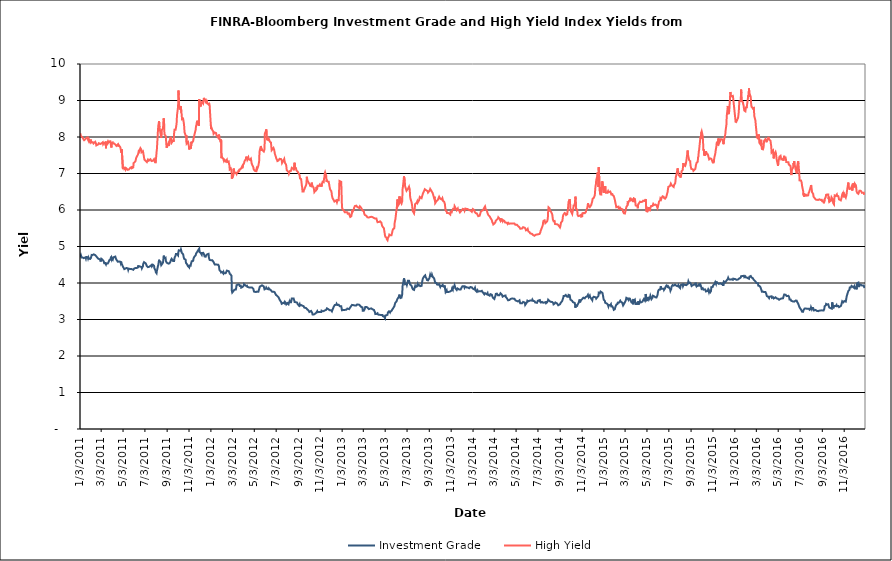
| Category | Investment Grade | High Yield |
|---|---|---|
| 1/3/11 | 4.707 | 8.102 |
| 1/4/11 | 4.687 | 8.068 |
| 1/5/11 | 4.763 | 8.023 |
| 1/6/11 | 4.756 | 8.024 |
| 1/7/11 | 4.7 | 7.997 |
| 1/10/11 | 4.699 | 7.987 |
| 1/11/11 | 4.695 | 7.979 |
| 1/12/11 | 4.706 | 7.94 |
| 1/13/11 | 4.682 | 7.933 |
| 1/14/11 | 4.658 | 7.912 |
| 1/18/11 | 4.703 | 7.948 |
| 1/19/11 | 4.671 | 7.953 |
| 1/20/11 | 4.712 | 7.966 |
| 1/21/11 | 4.718 | 7.981 |
| 1/24/11 | 4.707 | 7.988 |
| 1/25/11 | 4.673 | 7.921 |
| 1/26/11 | 4.705 | 7.926 |
| 1/27/11 | 4.696 | 7.883 |
| 1/28/11 | 4.663 | 7.93 |
| 1/31/11 | 4.66 | 7.873 |
| 2/1/11 | 4.667 | 7.931 |
| 2/2/11 | 4.688 | 7.899 |
| 2/3/11 | 4.727 | 7.911 |
| 2/4/11 | 4.77 | 7.851 |
| 2/7/11 | 4.768 | 7.858 |
| 2/8/11 | 4.779 | 7.831 |
| 2/9/11 | 4.783 | 7.823 |
| 2/10/11 | 4.785 | 7.809 |
| 2/11/11 | 4.773 | 7.839 |
| 2/14/11 | 4.764 | 7.868 |
| 2/15/11 | 4.753 | 7.851 |
| 2/16/11 | 4.745 | 7.822 |
| 2/17/11 | 4.73 | 7.77 |
| 2/18/11 | 4.739 | 7.791 |
| 2/22/11 | 4.668 | 7.795 |
| 2/23/11 | 4.665 | 7.81 |
| 2/24/11 | 4.682 | 7.83 |
| 2/25/11 | 4.655 | 7.818 |
| 2/28/11 | 4.638 | 7.808 |
| 3/1/11 | 4.589 | 7.83 |
| 3/2/11 | 4.586 | 7.834 |
| 3/3/11 | 4.664 | 7.823 |
| 3/4/11 | 4.638 | 7.821 |
| 3/7/11 | 4.629 | 7.855 |
| 3/8/11 | 4.65 | 7.805 |
| 3/9/11 | 4.614 | 7.813 |
| 3/10/11 | 4.586 | 7.838 |
| 3/11/11 | 4.543 | 7.823 |
| 3/14/11 | 4.548 | 7.811 |
| 3/15/11 | 4.542 | 7.874 |
| 3/16/11 | 4.508 | 7.69 |
| 3/17/11 | 4.538 | 7.866 |
| 3/18/11 | 4.528 | 7.809 |
| 3/21/11 | 4.536 | 7.872 |
| 3/22/11 | 4.552 | 7.838 |
| 3/23/11 | 4.57 | 7.856 |
| 3/24/11 | 4.59 | 7.865 |
| 3/25/11 | 4.62 | 7.879 |
| 3/28/11 | 4.647 | 7.882 |
| 3/29/11 | 4.677 | 7.901 |
| 3/30/11 | 4.679 | 7.889 |
| 3/31/11 | 4.641 | 7.711 |
| 4/1/11 | 4.7 | 7.847 |
| 4/4/11 | 4.648 | 7.854 |
| 4/5/11 | 4.683 | 7.823 |
| 4/6/11 | 4.708 | 7.827 |
| 4/7/11 | 4.711 | 7.823 |
| 4/8/11 | 4.712 | 7.821 |
| 4/11/11 | 4.724 | 7.795 |
| 4/12/11 | 4.686 | 7.786 |
| 4/13/11 | 4.658 | 7.811 |
| 4/14/11 | 4.675 | 7.756 |
| 4/15/11 | 4.623 | 7.772 |
| 4/18/11 | 4.582 | 7.794 |
| 4/19/11 | 4.576 | 7.741 |
| 4/20/11 | 4.584 | 7.785 |
| 4/21/11 | 4.59 | 7.782 |
| 4/25/11 | 4.582 | 7.718 |
| 4/26/11 | 4.548 | 7.699 |
| 4/27/11 | 4.587 | 7.714 |
| 4/28/11 | 4.54 | 7.566 |
| 4/29/11 | 4.516 | 7.663 |
| 5/2/11 | 4.455 | 7.147 |
| 5/3/11 | 4.438 | 7.173 |
| 5/4/11 | 4.418 | 7.156 |
| 5/5/11 | 4.409 | 7.158 |
| 5/6/11 | 4.381 | 7.124 |
| 5/9/11 | 4.396 | 7.15 |
| 5/10/11 | 4.417 | 7.107 |
| 5/11/11 | 4.414 | 7.123 |
| 5/12/11 | 4.41 | 7.139 |
| 5/13/11 | 4.401 | 7.138 |
| 5/16/11 | 4.4 | 7.101 |
| 5/17/11 | 4.361 | 7.107 |
| 5/18/11 | 4.394 | 7.121 |
| 5/19/11 | 4.411 | 7.112 |
| 5/20/11 | 4.402 | 7.124 |
| 5/23/11 | 4.383 | 7.158 |
| 5/24/11 | 4.401 | 7.152 |
| 5/25/11 | 4.403 | 7.177 |
| 5/26/11 | 4.385 | 7.173 |
| 5/27/11 | 4.38 | 7.143 |
| 5/31/11 | 4.362 | 7.166 |
| 6/1/11 | 4.344 | 7.286 |
| 6/2/11 | 4.385 | 7.311 |
| 6/3/11 | 4.4 | 7.312 |
| 6/6/11 | 4.411 | 7.332 |
| 6/7/11 | 4.412 | 7.373 |
| 6/8/11 | 4.393 | 7.424 |
| 6/9/11 | 4.408 | 7.443 |
| 6/10/11 | 4.409 | 7.449 |
| 6/13/11 | 4.428 | 7.518 |
| 6/14/11 | 4.481 | 7.547 |
| 6/15/11 | 4.453 | 7.572 |
| 6/16/11 | 4.433 | 7.65 |
| 6/17/11 | 4.436 | 7.617 |
| 6/20/11 | 4.448 | 7.694 |
| 6/21/11 | 4.448 | 7.693 |
| 6/22/11 | 4.441 | 7.662 |
| 6/23/11 | 4.436 | 7.581 |
| 6/24/11 | 4.401 | 7.57 |
| 6/27/11 | 4.464 | 7.61 |
| 6/28/11 | 4.533 | 7.562 |
| 6/29/11 | 4.56 | 7.554 |
| 6/30/11 | 4.572 | 7.548 |
| 7/1/11 | 4.575 | 7.384 |
| 7/5/11 | 4.534 | 7.342 |
| 7/6/11 | 4.512 | 7.34 |
| 7/7/11 | 4.543 | 7.321 |
| 7/8/11 | 4.46 | 7.312 |
| 7/11/11 | 4.435 | 7.38 |
| 7/12/11 | 4.423 | 7.392 |
| 7/13/11 | 4.412 | 7.35 |
| 7/14/11 | 4.442 | 7.349 |
| 7/15/11 | 4.444 | 7.365 |
| 7/18/11 | 4.469 | 7.391 |
| 7/19/11 | 4.477 | 7.395 |
| 7/20/11 | 4.455 | 7.37 |
| 7/21/11 | 4.493 | 7.342 |
| 7/22/11 | 4.456 | 7.356 |
| 7/25/11 | 4.498 | 7.349 |
| 7/26/11 | 4.489 | 7.33 |
| 7/27/11 | 4.485 | 7.366 |
| 7/28/11 | 4.473 | 7.392 |
| 7/29/11 | 4.403 | 7.402 |
| 8/1/11 | 4.339 | 7.284 |
| 8/2/11 | 4.296 | 7.374 |
| 8/3/11 | 4.278 | 7.463 |
| 8/4/11 | 4.268 | 7.586 |
| 8/5/11 | 4.337 | 7.673 |
| 8/8/11 | 4.47 | 8.204 |
| 8/9/11 | 4.498 | 8.318 |
| 8/10/11 | 4.484 | 8.332 |
| 8/11/11 | 4.637 | 8.431 |
| 8/12/11 | 4.589 | 8.274 |
| 8/15/11 | 4.581 | 8.097 |
| 8/16/11 | 4.534 | 8.082 |
| 8/17/11 | 4.488 | 7.981 |
| 8/18/11 | 4.484 | 8.141 |
| 8/19/11 | 4.517 | 8.197 |
| 8/22/11 | 4.561 | 8.236 |
| 8/23/11 | 4.649 | 8.421 |
| 8/24/11 | 4.75 | 8.512 |
| 8/25/11 | 4.714 | 8.404 |
| 8/26/11 | 4.681 | 8.072 |
| 8/29/11 | 4.694 | 8.036 |
| 8/30/11 | 4.606 | 8.007 |
| 8/31/11 | 4.58 | 7.822 |
| 9/1/11 | 4.56 | 7.707 |
| 9/2/11 | 4.535 | 7.688 |
| 9/6/11 | 4.53 | 7.822 |
| 9/7/11 | 4.537 | 7.755 |
| 9/8/11 | 4.53 | 7.77 |
| 9/9/11 | 4.539 | 7.823 |
| 9/12/11 | 4.59 | 8.004 |
| 9/13/11 | 4.632 | 7.956 |
| 9/14/11 | 4.627 | 7.884 |
| 9/15/11 | 4.663 | 7.842 |
| 9/16/11 | 4.647 | 7.838 |
| 9/19/11 | 4.601 | 7.905 |
| 9/20/11 | 4.602 | 7.867 |
| 9/21/11 | 4.585 | 7.924 |
| 9/22/11 | 4.604 | 8.111 |
| 9/23/11 | 4.687 | 8.198 |
| 9/26/11 | 4.753 | 8.2 |
| 9/27/11 | 4.796 | 8.176 |
| 9/28/11 | 4.815 | 8.306 |
| 9/29/11 | 4.804 | 8.397 |
| 9/30/11 | 4.796 | 8.597 |
| 10/3/11 | 4.758 | 8.833 |
| 10/4/11 | 4.865 | 9.274 |
| 10/5/11 | 4.896 | 9.146 |
| 10/6/11 | 4.889 | 8.849 |
| 10/7/11 | 4.896 | 8.774 |
| 10/10/11 | 4.884 | 8.759 |
| 10/11/11 | 4.92 | 8.841 |
| 10/12/11 | 4.885 | 8.668 |
| 10/13/11 | 4.832 | 8.629 |
| 10/14/11 | 4.822 | 8.488 |
| 10/17/11 | 4.787 | 8.501 |
| 10/18/11 | 4.743 | 8.518 |
| 10/19/11 | 4.691 | 8.381 |
| 10/20/11 | 4.662 | 8.288 |
| 10/21/11 | 4.653 | 8.132 |
| 10/24/11 | 4.64 | 8.041 |
| 10/25/11 | 4.55 | 7.993 |
| 10/26/11 | 4.534 | 8.05 |
| 10/27/11 | 4.537 | 7.819 |
| 10/28/11 | 4.514 | 7.833 |
| 10/31/11 | 4.455 | 7.86 |
| 11/1/11 | 4.471 | 7.807 |
| 11/2/11 | 4.431 | 7.758 |
| 11/3/11 | 4.424 | 7.657 |
| 11/4/11 | 4.48 | 7.703 |
| 11/7/11 | 4.473 | 7.73 |
| 11/8/11 | 4.523 | 7.682 |
| 11/9/11 | 4.559 | 7.869 |
| 11/10/11 | 4.597 | 7.838 |
| 11/11/11 | 4.583 | 7.822 |
| 11/14/11 | 4.608 | 7.885 |
| 11/15/11 | 4.667 | 7.952 |
| 11/16/11 | 4.662 | 7.983 |
| 11/17/11 | 4.714 | 8.039 |
| 11/18/11 | 4.723 | 8.06 |
| 11/21/11 | 4.761 | 8.201 |
| 11/22/11 | 4.803 | 8.293 |
| 11/23/11 | 4.825 | 8.322 |
| 11/25/11 | 4.849 | 8.445 |
| 11/28/11 | 4.9 | 8.329 |
| 11/29/11 | 4.907 | 8.382 |
| 11/30/11 | 4.903 | 8.311 |
| 12/1/11 | 4.944 | 9.038 |
| 12/2/11 | 4.849 | 8.95 |
| 12/5/11 | 4.824 | 8.837 |
| 12/6/11 | 4.808 | 8.852 |
| 12/7/11 | 4.815 | 8.935 |
| 12/8/11 | 4.775 | 8.944 |
| 12/9/11 | 4.824 | 8.964 |
| 12/12/11 | 4.826 | 8.918 |
| 12/13/11 | 4.814 | 8.961 |
| 12/14/11 | 4.796 | 9.072 |
| 12/15/11 | 4.771 | 9.036 |
| 12/16/11 | 4.726 | 9.006 |
| 12/19/11 | 4.72 | 9.022 |
| 12/20/11 | 4.752 | 8.926 |
| 12/21/11 | 4.762 | 9.013 |
| 12/22/11 | 4.758 | 8.997 |
| 12/23/11 | 4.785 | 8.923 |
| 12/27/11 | 4.798 | 8.891 |
| 12/28/11 | 4.696 | 8.936 |
| 12/29/11 | 4.681 | 8.906 |
| 12/30/11 | 4.631 | 8.86 |
| 1/3/12 | 4.624 | 8.216 |
| 1/4/12 | 4.644 | 8.259 |
| 1/5/12 | 4.644 | 8.232 |
| 1/6/12 | 4.626 | 8.199 |
| 1/9/12 | 4.59 | 8.152 |
| 1/10/12 | 4.585 | 8.087 |
| 1/11/12 | 4.55 | 8.061 |
| 1/12/12 | 4.527 | 8.108 |
| 1/13/12 | 4.51 | 8.124 |
| 1/17/12 | 4.51 | 8.108 |
| 1/18/12 | 4.485 | 8.052 |
| 1/19/12 | 4.488 | 8.052 |
| 1/20/12 | 4.503 | 8.047 |
| 1/23/12 | 4.499 | 7.982 |
| 1/24/12 | 4.515 | 7.979 |
| 1/25/12 | 4.463 | 8.067 |
| 1/26/12 | 4.377 | 8.005 |
| 1/27/12 | 4.344 | 7.944 |
| 1/30/12 | 4.318 | 7.856 |
| 1/31/12 | 4.288 | 7.93 |
| 2/1/12 | 4.311 | 7.42 |
| 2/2/12 | 4.283 | 7.458 |
| 2/3/12 | 4.302 | 7.45 |
| 2/6/12 | 4.261 | 7.402 |
| 2/7/12 | 4.294 | 7.41 |
| 2/8/12 | 4.264 | 7.338 |
| 2/9/12 | 4.292 | 7.322 |
| 2/10/12 | 4.28 | 7.37 |
| 2/13/12 | 4.27 | 7.333 |
| 2/14/12 | 4.268 | 7.355 |
| 2/15/12 | 4.272 | 7.348 |
| 2/16/12 | 4.34 | 7.377 |
| 2/17/12 | 4.318 | 7.315 |
| 2/21/12 | 4.326 | 7.333 |
| 2/22/12 | 4.307 | 7.259 |
| 2/23/12 | 4.289 | 7.23 |
| 2/24/12 | 4.256 | 7.113 |
| 2/27/12 | 4.227 | 7.141 |
| 2/28/12 | 4.205 | 7.128 |
| 2/29/12 | 4.196 | 7.087 |
| 3/1/12 | 3.782 | 6.859 |
| 3/2/12 | 3.739 | 6.877 |
| 3/5/12 | 3.776 | 6.946 |
| 3/6/12 | 3.792 | 7.137 |
| 3/7/12 | 3.798 | 7.084 |
| 3/8/12 | 3.816 | 7.085 |
| 3/9/12 | 3.829 | 7.01 |
| 3/12/12 | 3.82 | 7.02 |
| 3/13/12 | 3.866 | 7.002 |
| 3/14/12 | 3.94 | 6.987 |
| 3/15/12 | 3.944 | 7.022 |
| 3/16/12 | 3.939 | 7.01 |
| 3/19/12 | 3.961 | 7.042 |
| 3/20/12 | 3.981 | 7.089 |
| 3/21/12 | 3.94 | 7.051 |
| 3/22/12 | 3.95 | 7.109 |
| 3/23/12 | 3.919 | 7.133 |
| 3/26/12 | 3.924 | 7.127 |
| 3/27/12 | 3.874 | 7.107 |
| 3/28/12 | 3.883 | 7.113 |
| 3/29/12 | 3.883 | 7.181 |
| 3/30/12 | 3.888 | 7.142 |
| 4/2/12 | 3.914 | 7.257 |
| 4/3/12 | 3.93 | 7.25 |
| 4/4/12 | 3.973 | 7.286 |
| 4/5/12 | 3.958 | 7.331 |
| 4/9/12 | 3.923 | 7.398 |
| 4/10/12 | 3.915 | 7.462 |
| 4/11/12 | 3.932 | 7.466 |
| 4/12/12 | 3.927 | 7.411 |
| 4/13/12 | 3.896 | 7.375 |
| 4/16/12 | 3.885 | 7.44 |
| 4/17/12 | 3.895 | 7.391 |
| 4/18/12 | 3.887 | 7.378 |
| 4/19/12 | 3.875 | 7.389 |
| 4/20/12 | 3.891 | 7.374 |
| 4/23/12 | 3.88 | 7.407 |
| 4/24/12 | 3.89 | 7.354 |
| 4/25/12 | 3.902 | 7.283 |
| 4/26/12 | 3.877 | 7.261 |
| 4/27/12 | 3.859 | 7.23 |
| 4/30/12 | 3.838 | 7.166 |
| 5/1/12 | 3.79 | 7.111 |
| 5/2/12 | 3.763 | 7.089 |
| 5/3/12 | 3.753 | 7.084 |
| 5/4/12 | 3.741 | 7.073 |
| 5/7/12 | 3.754 | 7.065 |
| 5/8/12 | 3.736 | 7.096 |
| 5/9/12 | 3.758 | 7.133 |
| 5/10/12 | 3.764 | 7.106 |
| 5/11/12 | 3.753 | 7.114 |
| 5/14/12 | 3.761 | 7.218 |
| 5/15/12 | 3.777 | 7.243 |
| 5/16/12 | 3.834 | 7.333 |
| 5/17/12 | 3.87 | 7.578 |
| 5/18/12 | 3.902 | 7.646 |
| 5/21/12 | 3.917 | 7.752 |
| 5/22/12 | 3.933 | 7.622 |
| 5/23/12 | 3.918 | 7.682 |
| 5/24/12 | 3.937 | 7.672 |
| 5/25/12 | 3.915 | 7.64 |
| 5/29/12 | 3.905 | 7.602 |
| 5/30/12 | 3.862 | 7.632 |
| 5/31/12 | 3.826 | 7.662 |
| 6/1/12 | 3.818 | 8.092 |
| 6/4/12 | 3.85 | 8.17 |
| 6/5/12 | 3.878 | 8.21 |
| 6/6/12 | 3.886 | 8.066 |
| 6/7/12 | 3.856 | 7.931 |
| 6/8/12 | 3.836 | 7.933 |
| 6/11/12 | 3.828 | 7.914 |
| 6/12/12 | 3.856 | 7.949 |
| 6/13/12 | 3.86 | 7.943 |
| 6/14/12 | 3.863 | 7.942 |
| 6/15/12 | 3.821 | 7.87 |
| 6/18/12 | 3.8 | 7.848 |
| 6/19/12 | 3.803 | 7.732 |
| 6/20/12 | 3.792 | 7.639 |
| 6/21/12 | 3.763 | 7.625 |
| 6/22/12 | 3.773 | 7.65 |
| 6/25/12 | 3.762 | 7.701 |
| 6/26/12 | 3.776 | 7.674 |
| 6/27/12 | 3.768 | 7.646 |
| 6/28/12 | 3.751 | 7.632 |
| 6/29/12 | 3.757 | 7.535 |
| 7/2/12 | 3.673 | 7.447 |
| 7/3/12 | 3.66 | 7.406 |
| 7/5/12 | 3.651 | 7.378 |
| 7/6/12 | 3.629 | 7.342 |
| 7/9/12 | 3.611 | 7.357 |
| 7/10/12 | 3.588 | 7.354 |
| 7/11/12 | 3.572 | 7.34 |
| 7/12/12 | 3.541 | 7.402 |
| 7/13/12 | 3.535 | 7.388 |
| 7/16/12 | 3.487 | 7.396 |
| 7/17/12 | 3.48 | 7.399 |
| 7/18/12 | 3.431 | 7.363 |
| 7/19/12 | 3.418 | 7.288 |
| 7/20/12 | 3.447 | 7.314 |
| 7/23/12 | 3.462 | 7.359 |
| 7/24/12 | 3.448 | 7.378 |
| 7/25/12 | 3.445 | 7.399 |
| 7/26/12 | 3.44 | 7.346 |
| 7/27/12 | 3.483 | 7.292 |
| 7/30/12 | 3.45 | 7.246 |
| 7/31/12 | 3.416 | 7.184 |
| 8/1/12 | 3.428 | 7.092 |
| 8/2/12 | 3.414 | 7.106 |
| 8/3/12 | 3.45 | 7.088 |
| 8/6/12 | 3.418 | 7.041 |
| 8/7/12 | 3.461 | 7.003 |
| 8/8/12 | 3.479 | 7.034 |
| 8/9/12 | 3.504 | 7.035 |
| 8/10/12 | 3.473 | 7.07 |
| 8/13/12 | 3.471 | 7.073 |
| 8/14/12 | 3.518 | 7.074 |
| 8/15/12 | 3.575 | 7.155 |
| 8/16/12 | 3.592 | 7.161 |
| 8/17/12 | 3.585 | 7.148 |
| 8/20/12 | 3.578 | 7.123 |
| 8/21/12 | 3.57 | 7.089 |
| 8/22/12 | 3.519 | 7.077 |
| 8/23/12 | 3.479 | 7.292 |
| 8/24/12 | 3.488 | 7.141 |
| 8/27/12 | 3.472 | 7.141 |
| 8/28/12 | 3.462 | 7.084 |
| 8/29/12 | 3.479 | 7.101 |
| 8/30/12 | 3.462 | 7.07 |
| 8/31/12 | 3.429 | 7.058 |
| 9/4/12 | 3.381 | 6.991 |
| 9/5/12 | 3.393 | 6.999 |
| 9/6/12 | 3.42 | 6.945 |
| 9/7/12 | 3.379 | 6.864 |
| 9/10/12 | 3.397 | 6.85 |
| 9/11/12 | 3.389 | 6.773 |
| 9/12/12 | 3.394 | 6.683 |
| 9/13/12 | 3.38 | 6.624 |
| 9/14/12 | 3.386 | 6.506 |
| 9/17/12 | 3.365 | 6.507 |
| 9/18/12 | 3.349 | 6.545 |
| 9/19/12 | 3.325 | 6.538 |
| 9/20/12 | 3.34 | 6.588 |
| 9/21/12 | 3.334 | 6.594 |
| 9/24/12 | 3.314 | 6.685 |
| 9/25/12 | 3.315 | 6.734 |
| 9/26/12 | 3.304 | 6.91 |
| 9/27/12 | 3.28 | 6.846 |
| 9/28/12 | 3.261 | 6.81 |
| 10/1/12 | 3.242 | 6.745 |
| 10/2/12 | 3.225 | 6.758 |
| 10/3/12 | 3.206 | 6.729 |
| 10/4/12 | 3.198 | 6.708 |
| 10/5/12 | 3.217 | 6.665 |
| 10/8/12 | 3.234 | 6.651 |
| 10/9/12 | 3.211 | 6.699 |
| 10/10/12 | 3.215 | 6.75 |
| 10/11/12 | 3.18 | 6.673 |
| 10/12/12 | 3.137 | 6.659 |
| 10/15/12 | 3.135 | 6.614 |
| 10/16/12 | 3.134 | 6.56 |
| 10/17/12 | 3.131 | 6.493 |
| 10/18/12 | 3.149 | 6.482 |
| 10/19/12 | 3.16 | 6.522 |
| 10/22/12 | 3.183 | 6.536 |
| 10/23/12 | 3.201 | 6.636 |
| 10/24/12 | 3.205 | 6.564 |
| 10/25/12 | 3.228 | 6.597 |
| 10/26/12 | 3.2 | 6.662 |
| 10/29/12 | 3.203 | 6.656 |
| 10/30/12 | 3.206 | 6.657 |
| 10/31/12 | 3.18 | 6.676 |
| 11/1/12 | 3.205 | 6.697 |
| 11/2/12 | 3.215 | 6.665 |
| 11/5/12 | 3.207 | 6.673 |
| 11/6/12 | 3.241 | 6.638 |
| 11/7/12 | 3.226 | 6.716 |
| 11/8/12 | 3.223 | 6.722 |
| 11/9/12 | 3.226 | 6.772 |
| 11/12/12 | 3.231 | 6.76 |
| 11/13/12 | 3.234 | 6.859 |
| 11/14/12 | 3.234 | 6.896 |
| 11/15/12 | 3.248 | 7.004 |
| 11/16/12 | 3.256 | 7.034 |
| 11/19/12 | 3.264 | 6.942 |
| 11/20/12 | 3.279 | 6.776 |
| 11/21/12 | 3.306 | 6.812 |
| 11/23/12 | 3.3 | 6.777 |
| 11/26/12 | 3.276 | 6.775 |
| 11/27/12 | 3.269 | 6.718 |
| 11/28/12 | 3.258 | 6.697 |
| 11/29/12 | 3.25 | 6.607 |
| 11/30/12 | 3.244 | 6.561 |
| 12/3/12 | 3.252 | 6.521 |
| 12/4/12 | 3.247 | 6.486 |
| 12/5/12 | 3.223 | 6.392 |
| 12/6/12 | 3.219 | 6.372 |
| 12/7/12 | 3.243 | 6.317 |
| 12/10/12 | 3.35 | 6.272 |
| 12/11/12 | 3.362 | 6.245 |
| 12/12/12 | 3.371 | 6.232 |
| 12/13/12 | 3.396 | 6.227 |
| 12/14/12 | 3.383 | 6.224 |
| 12/17/12 | 3.403 | 6.265 |
| 12/18/12 | 3.431 | 6.248 |
| 12/19/12 | 3.404 | 6.208 |
| 12/20/12 | 3.399 | 6.227 |
| 12/21/12 | 3.382 | 6.275 |
| 12/24/12 | 3.403 | 6.269 |
| 12/26/12 | 3.377 | 6.796 |
| 12/27/12 | 3.36 | 6.778 |
| 12/28/12 | 3.343 | 6.772 |
| 12/31/12 | 3.362 | 6.769 |
| 1/2/13 | 3.253 | 6.097 |
| 1/3/13 | 3.262 | 6.031 |
| 1/4/13 | 3.275 | 6.009 |
| 1/7/13 | 3.263 | 5.989 |
| 1/8/13 | 3.254 | 5.982 |
| 1/9/13 | 3.254 | 5.981 |
| 1/10/13 | 3.263 | 5.936 |
| 1/11/13 | 3.269 | 5.922 |
| 1/14/13 | 3.266 | 5.942 |
| 1/15/13 | 3.27 | 5.969 |
| 1/16/13 | 3.27 | 5.969 |
| 1/17/13 | 3.3 | 5.937 |
| 1/18/13 | 3.291 | 5.899 |
| 1/22/13 | 3.284 | 5.903 |
| 1/23/13 | 3.277 | 5.86 |
| 1/24/13 | 3.294 | 5.846 |
| 1/25/13 | 3.332 | 5.809 |
| 1/28/13 | 3.372 | 5.827 |
| 1/29/13 | 3.379 | 5.889 |
| 1/30/13 | 3.401 | 5.942 |
| 1/31/13 | 3.394 | 6.003 |
| 2/1/13 | 3.393 | 5.96 |
| 2/4/13 | 3.392 | 6.024 |
| 2/5/13 | 3.412 | 6.065 |
| 2/6/13 | 3.397 | 6.086 |
| 2/7/13 | 3.382 | 6.107 |
| 2/8/13 | 3.395 | 6.111 |
| 2/11/13 | 3.385 | 6.118 |
| 2/12/13 | 3.399 | 6.096 |
| 2/13/13 | 3.412 | 6.09 |
| 2/14/13 | 3.398 | 6.075 |
| 2/15/13 | 3.402 | 6.08 |
| 2/19/13 | 3.405 | 6.055 |
| 2/20/13 | 3.406 | 6.039 |
| 2/21/13 | 3.382 | 6.101 |
| 2/22/13 | 3.373 | 6.085 |
| 2/25/13 | 3.342 | 6.054 |
| 2/26/13 | 3.328 | 6.07 |
| 2/27/13 | 3.332 | 6.052 |
| 2/28/13 | 3.335 | 5.988 |
| 3/1/13 | 3.239 | 5.98 |
| 3/4/13 | 3.242 | 5.966 |
| 3/5/13 | 3.255 | 5.902 |
| 3/6/13 | 3.279 | 5.894 |
| 3/7/13 | 3.308 | 5.863 |
| 3/8/13 | 3.345 | 5.861 |
| 3/11/13 | 3.345 | 5.841 |
| 3/12/13 | 3.32 | 5.826 |
| 3/13/13 | 3.327 | 5.822 |
| 3/14/13 | 3.328 | 5.799 |
| 3/15/13 | 3.305 | 5.794 |
| 3/18/13 | 3.284 | 5.795 |
| 3/19/13 | 3.26 | 5.788 |
| 3/20/13 | 3.291 | 5.81 |
| 3/21/13 | 3.296 | 5.805 |
| 3/22/13 | 3.302 | 5.8 |
| 3/25/13 | 3.303 | 5.814 |
| 3/26/13 | 3.312 | 5.815 |
| 3/27/13 | 3.283 | 5.806 |
| 3/28/13 | 3.28 | 5.806 |
| 4/1/13 | 3.264 | 5.782 |
| 4/2/13 | 3.274 | 5.776 |
| 4/3/13 | 3.242 | 5.781 |
| 4/4/13 | 3.202 | 5.769 |
| 4/5/13 | 3.149 | 5.775 |
| 4/8/13 | 3.151 | 5.769 |
| 4/9/13 | 3.146 | 5.733 |
| 4/10/13 | 3.17 | 5.712 |
| 4/11/13 | 3.172 | 5.667 |
| 4/12/13 | 3.142 | 5.651 |
| 4/15/13 | 3.128 | 5.669 |
| 4/16/13 | 3.134 | 5.653 |
| 4/17/13 | 3.128 | 5.675 |
| 4/18/13 | 3.127 | 5.689 |
| 4/19/13 | 3.135 | 5.67 |
| 4/22/13 | 3.126 | 5.653 |
| 4/23/13 | 3.117 | 5.6 |
| 4/24/13 | 3.105 | 5.569 |
| 4/25/13 | 3.125 | 5.572 |
| 4/26/13 | 3.092 | 5.534 |
| 4/29/13 | 3.087 | 5.499 |
| 4/30/13 | 3.086 | 5.43 |
| 5/1/13 | 3.067 | 5.368 |
| 5/2/13 | 3.036 | 5.305 |
| 5/3/13 | 3.109 | 5.266 |
| 5/6/13 | 3.117 | 5.244 |
| 5/7/13 | 3.136 | 5.201 |
| 5/8/13 | 3.129 | 5.184 |
| 5/9/13 | 3.131 | 5.173 |
| 5/10/13 | 3.19 | 5.221 |
| 5/13/13 | 3.224 | 5.288 |
| 5/14/13 | 3.228 | 5.326 |
| 5/15/13 | 3.223 | 5.334 |
| 5/16/13 | 3.19 | 5.306 |
| 5/17/13 | 3.218 | 5.305 |
| 5/20/13 | 3.234 | 5.306 |
| 5/21/13 | 3.229 | 5.314 |
| 5/22/13 | 3.258 | 5.327 |
| 5/23/13 | 3.284 | 5.429 |
| 5/24/13 | 3.284 | 5.465 |
| 5/28/13 | 3.36 | 5.504 |
| 5/29/13 | 3.404 | 5.657 |
| 5/30/13 | 3.413 | 5.675 |
| 5/31/13 | 3.463 | 5.748 |
| 6/3/13 | 3.494 | 5.995 |
| 6/4/13 | 3.522 | 6.063 |
| 6/5/13 | 3.552 | 6.239 |
| 6/6/13 | 3.551 | 6.291 |
| 6/7/13 | 3.57 | 6.113 |
| 6/10/13 | 3.628 | 6.164 |
| 6/11/13 | 3.681 | 6.371 |
| 6/12/13 | 3.674 | 6.305 |
| 6/13/13 | 3.66 | 6.359 |
| 6/14/13 | 3.588 | 6.227 |
| 6/17/13 | 3.599 | 6.175 |
| 6/18/13 | 3.646 | 6.192 |
| 6/19/13 | 3.69 | 6.237 |
| 6/20/13 | 3.91 | 6.572 |
| 6/21/13 | 3.967 | 6.634 |
| 6/24/13 | 4.127 | 6.924 |
| 6/25/13 | 4.1 | 6.906 |
| 6/26/13 | 4.034 | 6.807 |
| 6/27/13 | 3.965 | 6.661 |
| 6/28/13 | 3.948 | 6.621 |
| 7/1/13 | 3.98 | 6.527 |
| 7/2/13 | 3.946 | 6.515 |
| 7/3/13 | 3.938 | 6.511 |
| 7/5/13 | 4.063 | 6.58 |
| 7/8/13 | 4.062 | 6.64 |
| 7/9/13 | 4.028 | 6.597 |
| 7/10/13 | 4.031 | 6.565 |
| 7/11/13 | 3.96 | 6.376 |
| 7/12/13 | 3.939 | 6.31 |
| 7/15/13 | 3.925 | 6.216 |
| 7/16/13 | 3.898 | 6.158 |
| 7/17/13 | 3.86 | 6.1 |
| 7/18/13 | 3.855 | 5.979 |
| 7/19/13 | 3.825 | 5.96 |
| 7/22/13 | 3.811 | 5.908 |
| 7/23/13 | 3.816 | 5.902 |
| 7/24/13 | 3.884 | 6.035 |
| 7/25/13 | 3.915 | 6.163 |
| 7/26/13 | 3.885 | 6.171 |
| 7/29/13 | 3.902 | 6.194 |
| 7/30/13 | 3.908 | 6.189 |
| 7/31/13 | 3.941 | 6.239 |
| 8/1/13 | 3.969 | 6.199 |
| 8/2/13 | 3.925 | 6.226 |
| 8/5/13 | 3.944 | 6.265 |
| 8/6/13 | 3.953 | 6.313 |
| 8/7/13 | 3.934 | 6.358 |
| 8/8/13 | 3.913 | 6.344 |
| 8/9/13 | 3.916 | 6.347 |
| 8/12/13 | 3.923 | 6.324 |
| 8/13/13 | 4.006 | 6.362 |
| 8/14/13 | 4.018 | 6.359 |
| 8/15/13 | 4.099 | 6.426 |
| 8/16/13 | 4.129 | 6.46 |
| 8/19/13 | 4.18 | 6.522 |
| 8/20/13 | 4.155 | 6.544 |
| 8/21/13 | 4.183 | 6.569 |
| 8/22/13 | 4.211 | 6.583 |
| 8/23/13 | 4.166 | 6.552 |
| 8/26/13 | 4.123 | 6.531 |
| 8/27/13 | 4.082 | 6.547 |
| 8/28/13 | 4.096 | 6.551 |
| 8/29/13 | 4.092 | 6.517 |
| 8/30/13 | 4.071 | 6.478 |
| 9/3/13 | 4.136 | 6.523 |
| 9/4/13 | 4.142 | 6.53 |
| 9/5/13 | 4.228 | 6.578 |
| 9/6/13 | 4.2 | 6.565 |
| 9/9/13 | 4.187 | 6.515 |
| 9/10/13 | 4.229 | 6.522 |
| 9/11/13 | 4.208 | 6.505 |
| 9/12/13 | 4.17 | 6.461 |
| 9/13/13 | 4.184 | 6.455 |
| 9/16/13 | 4.128 | 6.326 |
| 9/17/13 | 4.134 | 6.364 |
| 9/18/13 | 4.104 | 6.315 |
| 9/19/13 | 4.011 | 6.189 |
| 9/20/13 | 4.008 | 6.188 |
| 9/23/13 | 3.998 | 6.249 |
| 9/24/13 | 3.96 | 6.231 |
| 9/25/13 | 3.94 | 6.257 |
| 9/26/13 | 3.957 | 6.271 |
| 9/27/13 | 3.951 | 6.297 |
| 9/30/13 | 3.97 | 6.364 |
| 10/1/13 | 3.942 | 6.375 |
| 10/2/13 | 3.916 | 6.359 |
| 10/3/13 | 3.897 | 6.31 |
| 10/4/13 | 3.925 | 6.295 |
| 10/7/13 | 3.916 | 6.288 |
| 10/8/13 | 3.924 | 6.308 |
| 10/9/13 | 3.938 | 6.326 |
| 10/10/13 | 3.948 | 6.286 |
| 10/11/13 | 3.91 | 6.244 |
| 10/14/13 | 3.897 | 6.226 |
| 10/15/13 | 3.933 | 6.22 |
| 10/16/13 | 3.91 | 6.161 |
| 10/17/13 | 3.823 | 6.063 |
| 10/18/13 | 3.753 | 5.992 |
| 10/21/13 | 3.801 | 5.954 |
| 10/22/13 | 3.751 | 5.916 |
| 10/23/13 | 3.738 | 5.926 |
| 10/24/13 | 3.757 | 5.93 |
| 10/25/13 | 3.752 | 5.918 |
| 10/28/13 | 3.76 | 5.906 |
| 10/29/13 | 3.759 | 5.89 |
| 10/30/13 | 3.742 | 5.891 |
| 10/31/13 | 3.771 | 5.876 |
| 11/1/13 | 3.795 | 5.951 |
| 11/4/13 | 3.796 | 5.939 |
| 11/5/13 | 3.844 | 5.976 |
| 11/6/13 | 3.827 | 5.962 |
| 11/7/13 | 3.813 | 5.955 |
| 11/8/13 | 3.899 | 6.033 |
| 11/11/13 | 3.894 | 6.024 |
| 11/12/13 | 3.936 | 6.103 |
| 11/13/13 | 3.906 | 6.126 |
| 11/14/13 | 3.856 | 6.076 |
| 11/15/13 | 3.848 | 6.045 |
| 11/18/13 | 3.809 | 5.992 |
| 11/19/13 | 3.825 | 6.008 |
| 11/20/13 | 3.853 | 6.015 |
| 11/21/13 | 3.879 | 6.04 |
| 11/22/13 | 3.847 | 5.999 |
| 11/25/13 | 3.821 | 5.98 |
| 11/26/13 | 3.799 | 5.977 |
| 11/27/13 | 3.816 | 5.936 |
| 11/29/13 | 3.822 | 5.927 |
| 12/2/13 | 3.881 | 5.994 |
| 12/3/13 | 3.869 | 5.992 |
| 12/4/13 | 3.91 | 6.015 |
| 12/5/13 | 3.928 | 6.031 |
| 12/6/13 | 3.927 | 6.016 |
| 12/9/13 | 3.91 | 6.018 |
| 12/10/13 | 3.87 | 5.984 |
| 12/11/13 | 3.872 | 5.997 |
| 12/12/13 | 3.9 | 6.039 |
| 12/13/13 | 3.895 | 6.03 |
| 12/16/13 | 3.878 | 6.026 |
| 12/17/13 | 3.858 | 6.027 |
| 12/18/13 | 3.859 | 6.033 |
| 12/19/13 | 3.878 | 6.024 |
| 12/20/13 | 3.856 | 6.016 |
| 12/23/13 | 3.857 | 5.993 |
| 12/24/13 | 3.875 | 5.996 |
| 12/26/13 | 3.89 | 5.991 |
| 12/27/13 | 3.903 | 5.977 |
| 12/30/13 | 3.883 | 5.95 |
| 12/31/13 | 3.873 | 5.948 |
| 1/2/14 | 3.844 | 6.025 |
| 1/3/14 | 3.842 | 6.009 |
| 1/6/14 | 3.825 | 5.995 |
| 1/7/14 | 3.818 | 5.951 |
| 1/8/14 | 3.87 | 5.943 |
| 1/9/14 | 3.864 | 5.942 |
| 1/10/14 | 3.79 | 5.914 |
| 1/13/14 | 3.762 | 5.905 |
| 1/14/14 | 3.784 | 5.909 |
| 1/15/14 | 3.803 | 5.867 |
| 1/16/14 | 3.78 | 5.861 |
| 1/17/14 | 3.766 | 5.831 |
| 1/21/14 | 3.774 | 5.843 |
| 1/22/14 | 3.801 | 5.829 |
| 1/23/14 | 3.784 | 5.857 |
| 1/24/14 | 3.772 | 5.948 |
| 1/27/14 | 3.786 | 5.982 |
| 1/28/14 | 3.782 | 5.991 |
| 1/29/14 | 3.754 | 6.003 |
| 1/30/14 | 3.748 | 5.991 |
| 1/31/14 | 3.738 | 6.016 |
| 2/3/14 | 3.69 | 6.066 |
| 2/4/14 | 3.699 | 6.082 |
| 2/5/14 | 3.722 | 6.098 |
| 2/6/14 | 3.728 | 6.079 |
| 2/7/14 | 3.695 | 6.015 |
| 2/10/14 | 3.691 | 5.986 |
| 2/11/14 | 3.713 | 5.962 |
| 2/12/14 | 3.724 | 5.911 |
| 2/13/14 | 3.68 | 5.9 |
| 2/14/14 | 3.672 | 5.865 |
| 2/18/14 | 3.652 | 5.821 |
| 2/19/14 | 3.651 | 5.805 |
| 2/20/14 | 3.695 | 5.797 |
| 2/21/14 | 3.681 | 5.767 |
| 2/24/14 | 3.677 | 5.721 |
| 2/25/14 | 3.637 | 5.673 |
| 2/26/14 | 3.618 | 5.653 |
| 2/27/14 | 3.595 | 5.636 |
| 2/28/14 | 3.598 | 5.604 |
| 3/3/14 | 3.563 | 5.628 |
| 3/4/14 | 3.601 | 5.616 |
| 3/5/14 | 3.613 | 5.618 |
| 3/6/14 | 3.649 | 5.671 |
| 3/7/14 | 3.701 | 5.709 |
| 3/10/14 | 3.709 | 5.736 |
| 3/11/14 | 3.709 | 5.734 |
| 3/12/14 | 3.691 | 5.747 |
| 3/13/14 | 3.664 | 5.765 |
| 3/14/14 | 3.655 | 5.799 |
| 3/17/14 | 3.663 | 5.765 |
| 3/18/14 | 3.661 | 5.749 |
| 3/19/14 | 3.675 | 5.728 |
| 3/20/14 | 3.72 | 5.777 |
| 3/21/14 | 3.695 | 5.705 |
| 3/24/14 | 3.678 | 5.735 |
| 3/25/14 | 3.669 | 5.735 |
| 3/26/14 | 3.626 | 5.694 |
| 3/27/14 | 3.629 | 5.724 |
| 3/28/14 | 3.647 | 5.698 |
| 3/31/14 | 3.652 | 5.7 |
| 4/1/14 | 3.641 | 5.714 |
| 4/2/14 | 3.676 | 5.658 |
| 4/3/14 | 3.658 | 5.653 |
| 4/4/14 | 3.612 | 5.634 |
| 4/7/14 | 3.582 | 5.65 |
| 4/8/14 | 3.577 | 5.642 |
| 4/9/14 | 3.572 | 5.618 |
| 4/10/14 | 3.527 | 5.604 |
| 4/11/14 | 3.519 | 5.647 |
| 4/14/14 | 3.533 | 5.622 |
| 4/15/14 | 3.529 | 5.639 |
| 4/16/14 | 3.534 | 5.633 |
| 4/17/14 | 3.562 | 5.633 |
| 4/21/14 | 3.574 | 5.631 |
| 4/22/14 | 3.588 | 5.628 |
| 4/23/14 | 3.564 | 5.628 |
| 4/24/14 | 3.572 | 5.628 |
| 4/25/14 | 3.554 | 5.625 |
| 4/28/14 | 3.568 | 5.63 |
| 4/29/14 | 3.582 | 5.617 |
| 4/30/14 | 3.551 | 5.598 |
| 5/1/14 | 3.522 | 5.612 |
| 5/2/14 | 3.506 | 5.584 |
| 5/5/14 | 3.507 | 5.594 |
| 5/6/14 | 3.51 | 5.583 |
| 5/7/14 | 3.506 | 5.579 |
| 5/8/14 | 3.493 | 5.562 |
| 5/9/14 | 3.498 | 5.534 |
| 5/12/14 | 3.526 | 5.525 |
| 5/13/14 | 3.501 | 5.514 |
| 5/14/14 | 3.446 | 5.488 |
| 5/15/14 | 3.426 | 5.499 |
| 5/16/14 | 3.439 | 5.512 |
| 5/19/14 | 3.443 | 5.491 |
| 5/20/14 | 3.448 | 5.508 |
| 5/21/14 | 3.47 | 5.5 |
| 5/22/14 | 3.482 | 5.53 |
| 5/23/14 | 3.463 | 5.526 |
| 5/27/14 | 3.462 | 5.512 |
| 5/28/14 | 3.401 | 5.487 |
| 5/29/14 | 3.398 | 5.479 |
| 5/30/14 | 3.421 | 5.443 |
| 6/2/14 | 3.475 | 5.453 |
| 6/3/14 | 3.517 | 5.48 |
| 6/4/14 | 3.528 | 5.481 |
| 6/5/14 | 3.519 | 5.441 |
| 6/6/14 | 3.499 | 5.411 |
| 6/9/14 | 3.513 | 5.394 |
| 6/10/14 | 3.532 | 5.381 |
| 6/11/14 | 3.523 | 5.359 |
| 6/12/14 | 3.523 | 5.362 |
| 6/13/14 | 3.519 | 5.366 |
| 6/16/14 | 3.516 | 5.346 |
| 6/17/14 | 3.546 | 5.364 |
| 6/18/14 | 3.533 | 5.363 |
| 6/19/14 | 3.511 | 5.314 |
| 6/20/14 | 3.523 | 5.304 |
| 6/23/14 | 3.501 | 5.294 |
| 6/24/14 | 3.494 | 5.293 |
| 6/25/14 | 3.465 | 5.304 |
| 6/26/14 | 3.453 | 5.321 |
| 6/27/14 | 3.457 | 5.324 |
| 6/30/14 | 3.458 | 5.329 |
| 7/1/14 | 3.475 | 5.317 |
| 7/2/14 | 3.514 | 5.332 |
| 7/3/14 | 3.538 | 5.336 |
| 7/7/14 | 3.53 | 5.343 |
| 7/8/14 | 3.473 | 5.364 |
| 7/9/14 | 3.502 | 5.384 |
| 7/10/14 | 3.481 | 5.427 |
| 7/11/14 | 3.466 | 5.431 |
| 7/14/14 | 3.482 | 5.531 |
| 7/15/14 | 3.497 | 5.553 |
| 7/16/14 | 3.49 | 5.582 |
| 7/17/14 | 3.459 | 5.665 |
| 7/18/14 | 3.469 | 5.704 |
| 7/21/14 | 3.467 | 5.719 |
| 7/22/14 | 3.458 | 5.682 |
| 7/23/14 | 3.443 | 5.641 |
| 7/24/14 | 3.478 | 5.654 |
| 7/25/14 | 3.446 | 5.658 |
| 7/28/14 | 3.469 | 5.688 |
| 7/29/14 | 3.455 | 5.7 |
| 7/30/14 | 3.506 | 5.764 |
| 7/31/14 | 3.543 | 5.968 |
| 8/1/14 | 3.525 | 6.073 |
| 8/4/14 | 3.505 | 6.045 |
| 8/5/14 | 3.517 | 5.981 |
| 8/6/14 | 3.51 | 5.994 |
| 8/7/14 | 3.485 | 5.965 |
| 8/8/14 | 3.464 | 5.953 |
| 8/11/14 | 3.48 | 5.889 |
| 8/12/14 | 3.494 | 5.843 |
| 8/13/14 | 3.476 | 5.746 |
| 8/14/14 | 3.454 | 5.721 |
| 8/15/14 | 3.415 | 5.695 |
| 8/18/14 | 3.436 | 5.699 |
| 8/19/14 | 3.443 | 5.618 |
| 8/20/14 | 3.467 | 5.635 |
| 8/21/14 | 3.456 | 5.605 |
| 8/22/14 | 3.449 | 5.612 |
| 8/25/14 | 3.437 | 5.607 |
| 8/26/14 | 3.427 | 5.585 |
| 8/27/14 | 3.422 | 5.589 |
| 8/28/14 | 3.39 | 5.591 |
| 8/29/14 | 3.388 | 5.58 |
| 9/2/14 | 3.417 | 5.521 |
| 9/3/14 | 3.422 | 5.55 |
| 9/4/14 | 3.455 | 5.611 |
| 9/5/14 | 3.442 | 5.659 |
| 9/8/14 | 3.508 | 5.69 |
| 9/9/14 | 3.502 | 5.725 |
| 9/10/14 | 3.526 | 5.811 |
| 9/11/14 | 3.592 | 5.863 |
| 9/12/14 | 3.644 | 5.879 |
| 9/15/14 | 3.645 | 5.918 |
| 9/16/14 | 3.638 | 5.941 |
| 9/17/14 | 3.642 | 5.916 |
| 9/18/14 | 3.672 | 5.895 |
| 9/19/14 | 3.648 | 5.863 |
| 9/22/14 | 3.624 | 5.882 |
| 9/23/14 | 3.611 | 5.959 |
| 9/24/14 | 3.634 | 6.004 |
| 9/25/14 | 3.622 | 6.133 |
| 9/26/14 | 3.675 | 6.226 |
| 9/29/14 | 3.665 | 6.297 |
| 9/30/14 | 3.666 | 6.198 |
| 10/1/14 | 3.546 | 6.041 |
| 10/2/14 | 3.543 | 6.033 |
| 10/3/14 | 3.562 | 5.951 |
| 10/6/14 | 3.511 | 5.891 |
| 10/7/14 | 3.49 | 5.942 |
| 10/8/14 | 3.476 | 5.966 |
| 10/9/14 | 3.455 | 6.047 |
| 10/10/14 | 3.455 | 6.125 |
| 10/13/14 | 3.455 | 6.126 |
| 10/14/14 | 3.415 | 6.254 |
| 10/15/14 | 3.322 | 6.366 |
| 10/16/14 | 3.392 | 6.295 |
| 10/17/14 | 3.405 | 6.024 |
| 10/20/14 | 3.378 | 6.011 |
| 10/21/14 | 3.408 | 5.869 |
| 10/22/14 | 3.423 | 5.856 |
| 10/23/14 | 3.438 | 5.833 |
| 10/24/14 | 3.46 | 5.826 |
| 10/27/14 | 3.549 | 5.844 |
| 10/28/14 | 3.47 | 5.831 |
| 10/29/14 | 3.508 | 5.854 |
| 10/30/14 | 3.484 | 5.863 |
| 10/31/14 | 3.523 | 5.818 |
| 11/3/14 | 3.563 | 5.828 |
| 11/4/14 | 3.561 | 5.914 |
| 11/5/14 | 3.58 | 5.896 |
| 11/6/14 | 3.597 | 5.904 |
| 11/7/14 | 3.571 | 5.919 |
| 11/10/14 | 3.581 | 5.911 |
| 11/11/14 | 3.58 | 5.894 |
| 11/12/14 | 3.61 | 5.917 |
| 11/13/14 | 3.63 | 5.944 |
| 11/14/14 | 3.622 | 5.986 |
| 11/17/14 | 3.639 | 6.05 |
| 11/18/14 | 3.664 | 6.114 |
| 11/19/14 | 3.676 | 6.183 |
| 11/20/14 | 3.645 | 6.193 |
| 11/21/14 | 3.61 | 6.102 |
| 11/24/14 | 3.655 | 6.077 |
| 11/25/14 | 3.614 | 6.062 |
| 11/26/14 | 3.592 | 6.055 |
| 11/28/14 | 3.571 | 6.136 |
| 12/1/14 | 3.527 | 6.244 |
| 12/2/14 | 3.592 | 6.31 |
| 12/3/14 | 3.6 | 6.3 |
| 12/4/14 | 3.583 | 6.311 |
| 12/5/14 | 3.624 | 6.33 |
| 12/8/14 | 3.613 | 6.401 |
| 12/9/14 | 3.596 | 6.533 |
| 12/10/14 | 3.594 | 6.652 |
| 12/11/14 | 3.607 | 6.697 |
| 12/12/14 | 3.574 | 6.816 |
| 12/15/14 | 3.61 | 6.93 |
| 12/16/14 | 3.622 | 7.031 |
| 12/17/14 | 3.611 | 6.874 |
| 12/18/14 | 3.64 | 6.631 |
| 12/19/14 | 3.733 | 7.172 |
| 12/22/14 | 3.718 | 6.524 |
| 12/23/14 | 3.739 | 6.429 |
| 12/24/14 | 3.766 | 6.426 |
| 12/26/14 | 3.758 | 6.424 |
| 12/29/14 | 3.733 | 6.787 |
| 12/30/14 | 3.701 | 6.803 |
| 12/31/14 | 3.703 | 6.802 |
| 1/2/15 | 3.539 | 6.473 |
| 1/5/15 | 3.512 | 6.579 |
| 1/6/15 | 3.46 | 6.653 |
| 1/7/15 | 3.461 | 6.584 |
| 1/8/15 | 3.475 | 6.473 |
| 1/9/15 | 3.446 | 6.454 |
| 1/12/15 | 3.428 | 6.47 |
| 1/13/15 | 3.418 | 6.483 |
| 1/14/15 | 3.39 | 6.514 |
| 1/15/15 | 3.36 | 6.485 |
| 1/16/15 | 3.398 | 6.499 |
| 1/20/15 | 3.388 | 6.507 |
| 1/21/15 | 3.406 | 6.501 |
| 1/22/15 | 3.418 | 6.465 |
| 1/23/15 | 3.358 | 6.428 |
| 1/26/15 | 3.361 | 6.434 |
| 1/27/15 | 3.345 | 6.403 |
| 1/28/15 | 3.321 | 6.38 |
| 1/29/15 | 3.327 | 6.384 |
| 1/30/15 | 3.263 | 6.383 |
| 2/2/15 | 3.283 | 6.276 |
| 2/3/15 | 3.33 | 6.218 |
| 2/4/15 | 3.356 | 6.175 |
| 2/5/15 | 3.339 | 6.128 |
| 2/6/15 | 3.407 | 6.077 |
| 2/9/15 | 3.421 | 6.086 |
| 2/10/15 | 3.462 | 6.091 |
| 2/11/15 | 3.47 | 6.106 |
| 2/12/15 | 3.453 | 6.094 |
| 2/13/15 | 3.458 | 6.04 |
| 2/17/15 | 3.516 | 6.061 |
| 2/18/15 | 3.496 | 6.032 |
| 2/19/15 | 3.481 | 6.045 |
| 2/20/15 | 3.471 | 6.044 |
| 2/23/15 | 3.46 | 6.021 |
| 2/24/15 | 3.413 | 5.985 |
| 2/25/15 | 3.385 | 5.95 |
| 2/26/15 | 3.409 | 5.923 |
| 2/27/15 | 3.418 | 5.91 |
| 3/2/15 | 3.477 | 5.903 |
| 3/3/15 | 3.496 | 5.943 |
| 3/4/15 | 3.51 | 5.991 |
| 3/5/15 | 3.501 | 6 |
| 3/6/15 | 3.594 | 6.079 |
| 3/9/15 | 3.577 | 6.134 |
| 3/10/15 | 3.55 | 6.235 |
| 3/11/15 | 3.562 | 6.188 |
| 3/12/15 | 3.536 | 6.163 |
| 3/13/15 | 3.575 | 6.241 |
| 3/16/15 | 3.572 | 6.268 |
| 3/17/15 | 3.575 | 6.335 |
| 3/18/15 | 3.525 | 6.323 |
| 3/19/15 | 3.502 | 6.265 |
| 3/20/15 | 3.473 | 6.273 |
| 3/23/15 | 3.447 | 6.285 |
| 3/24/15 | 3.422 | 6.276 |
| 3/25/15 | 3.437 | 6.217 |
| 3/26/15 | 3.564 | 6.235 |
| 3/27/15 | 3.474 | 6.318 |
| 3/30/15 | 3.526 | 6.299 |
| 3/31/15 | 3.507 | 6.274 |
| 4/1/15 | 3.404 | 6.124 |
| 4/2/15 | 3.449 | 6.142 |
| 4/6/15 | 3.44 | 6.113 |
| 4/7/15 | 3.404 | 6.048 |
| 4/8/15 | 3.398 | 6.153 |
| 4/9/15 | 3.501 | 6.166 |
| 4/10/15 | 3.417 | 6.184 |
| 4/13/15 | 3.504 | 6.228 |
| 4/14/15 | 3.471 | 6.226 |
| 4/15/15 | 3.473 | 6.219 |
| 4/16/15 | 3.484 | 6.218 |
| 4/17/15 | 3.473 | 6.234 |
| 4/20/15 | 3.489 | 6.228 |
| 4/21/15 | 3.492 | 6.234 |
| 4/22/15 | 3.533 | 6.256 |
| 4/23/15 | 3.533 | 6.264 |
| 4/24/15 | 3.564 | 6.251 |
| 4/27/15 | 3.515 | 6.246 |
| 4/28/15 | 3.552 | 6.264 |
| 4/29/15 | 3.699 | 6.302 |
| 4/30/15 | 3.726 | 6.285 |
| 5/1/15 | 3.52 | 5.968 |
| 5/4/15 | 3.534 | 5.958 |
| 5/5/15 | 3.574 | 5.972 |
| 5/6/15 | 3.62 | 6.006 |
| 5/7/15 | 3.605 | 6.081 |
| 5/8/15 | 3.55 | 5.995 |
| 5/11/15 | 3.609 | 5.99 |
| 5/12/15 | 3.65 | 6.054 |
| 5/13/15 | 3.637 | 6.048 |
| 5/14/15 | 3.622 | 6.108 |
| 5/15/15 | 3.557 | 6.102 |
| 5/18/15 | 3.6 | 6.112 |
| 5/19/15 | 3.651 | 6.136 |
| 5/20/15 | 3.661 | 6.167 |
| 5/21/15 | 3.638 | 6.158 |
| 5/22/15 | 3.64 | 6.136 |
| 5/26/15 | 3.609 | 6.149 |
| 5/27/15 | 3.605 | 6.158 |
| 5/28/15 | 3.609 | 6.154 |
| 5/29/15 | 3.603 | 6.129 |
| 6/1/15 | 3.671 | 6.055 |
| 6/2/15 | 3.74 | 6.084 |
| 6/3/15 | 3.79 | 6.139 |
| 6/4/15 | 3.77 | 6.173 |
| 6/5/15 | 3.818 | 6.229 |
| 6/8/15 | 3.819 | 6.264 |
| 6/9/15 | 3.86 | 6.317 |
| 6/10/15 | 3.91 | 6.341 |
| 6/11/15 | 3.87 | 6.29 |
| 6/12/15 | 3.84 | 6.32 |
| 6/15/15 | 3.842 | 6.375 |
| 6/16/15 | 3.839 | 6.396 |
| 6/17/15 | 3.856 | 6.39 |
| 6/18/15 | 3.846 | 6.365 |
| 6/19/15 | 3.809 | 6.333 |
| 6/22/15 | 3.854 | 6.31 |
| 6/23/15 | 3.886 | 6.314 |
| 6/24/15 | 3.89 | 6.335 |
| 6/25/15 | 3.906 | 6.351 |
| 6/26/15 | 3.933 | 6.383 |
| 6/29/15 | 3.911 | 6.493 |
| 6/30/15 | 3.862 | 6.48 |
| 7/1/15 | 3.903 | 6.633 |
| 7/2/15 | 3.879 | 6.623 |
| 7/6/15 | 3.834 | 6.661 |
| 7/7/15 | 3.788 | 6.691 |
| 7/8/15 | 3.79 | 6.722 |
| 7/9/15 | 3.833 | 6.699 |
| 7/10/15 | 3.898 | 6.684 |
| 7/13/15 | 3.945 | 6.654 |
| 7/14/15 | 3.962 | 6.658 |
| 7/15/15 | 3.941 | 6.639 |
| 7/16/15 | 3.928 | 6.631 |
| 7/17/15 | 3.92 | 6.684 |
| 7/20/15 | 3.957 | 6.728 |
| 7/21/15 | 3.946 | 6.789 |
| 7/22/15 | 3.931 | 6.902 |
| 7/23/15 | 3.927 | 6.942 |
| 7/24/15 | 3.914 | 6.987 |
| 7/27/15 | 3.912 | 7.142 |
| 7/28/15 | 3.92 | 7.122 |
| 7/29/15 | 3.945 | 7.014 |
| 7/30/15 | 3.937 | 6.955 |
| 7/31/15 | 3.891 | 6.938 |
| 8/3/15 | 3.859 | 6.92 |
| 8/4/15 | 3.885 | 6.888 |
| 8/5/15 | 3.946 | 6.932 |
| 8/6/15 | 3.943 | 6.967 |
| 8/7/15 | 3.927 | 7.062 |
| 8/10/15 | 3.964 | 7.093 |
| 8/11/15 | 3.914 | 7.18 |
| 8/12/15 | 3.922 | 7.288 |
| 8/13/15 | 3.961 | 7.23 |
| 8/14/15 | 3.966 | 7.205 |
| 8/17/15 | 3.946 | 7.205 |
| 8/18/15 | 3.964 | 7.21 |
| 8/19/15 | 3.97 | 7.268 |
| 8/20/15 | 3.942 | 7.329 |
| 8/21/15 | 3.932 | 7.397 |
| 8/24/15 | 3.969 | 7.631 |
| 8/25/15 | 4.004 | 7.506 |
| 8/26/15 | 4.048 | 7.509 |
| 8/27/15 | 4.024 | 7.42 |
| 8/28/15 | 3.999 | 7.369 |
| 8/31/15 | 4.006 | 7.34 |
| 9/1/15 | 3.984 | 7.221 |
| 9/2/15 | 3.974 | 7.211 |
| 9/3/15 | 3.949 | 7.128 |
| 9/4/15 | 3.918 | 7.154 |
| 9/8/15 | 3.947 | 7.11 |
| 9/9/15 | 3.956 | 7.075 |
| 9/10/15 | 3.97 | 7.101 |
| 9/11/15 | 3.954 | 7.087 |
| 9/14/15 | 3.96 | 7.121 |
| 9/15/15 | 4.007 | 7.156 |
| 9/16/15 | 4.028 | 7.23 |
| 9/17/15 | 3.993 | 7.256 |
| 9/18/15 | 3.906 | 7.296 |
| 9/21/15 | 3.934 | 7.32 |
| 9/22/15 | 3.908 | 7.44 |
| 9/23/15 | 3.928 | 7.47 |
| 9/24/15 | 3.924 | 7.602 |
| 9/25/15 | 3.968 | 7.65 |
| 9/28/15 | 3.972 | 7.936 |
| 9/29/15 | 3.972 | 8.01 |
| 9/30/15 | 3.965 | 7.959 |
| 10/1/15 | 3.884 | 8.129 |
| 10/2/15 | 3.839 | 8.158 |
| 10/5/15 | 3.857 | 8.024 |
| 10/6/15 | 3.84 | 7.851 |
| 10/7/15 | 3.818 | 7.629 |
| 10/8/15 | 3.812 | 7.659 |
| 10/9/15 | 3.837 | 7.508 |
| 10/12/15 | 3.824 | 7.508 |
| 10/13/15 | 3.812 | 7.563 |
| 10/14/15 | 3.768 | 7.61 |
| 10/15/15 | 3.779 | 7.616 |
| 10/16/15 | 3.788 | 7.538 |
| 10/19/15 | 3.785 | 7.528 |
| 10/20/15 | 3.814 | 7.497 |
| 10/21/15 | 3.788 | 7.455 |
| 10/22/15 | 3.753 | 7.473 |
| 10/23/15 | 3.796 | 7.388 |
| 10/26/15 | 3.747 | 7.413 |
| 10/27/15 | 3.743 | 7.438 |
| 10/28/15 | 3.777 | 7.418 |
| 10/29/15 | 3.886 | 7.404 |
| 10/30/15 | 3.896 | 7.394 |
| 11/2/15 | 3.894 | 7.301 |
| 11/3/15 | 3.935 | 7.298 |
| 11/4/15 | 3.959 | 7.279 |
| 11/5/15 | 3.956 | 7.305 |
| 11/6/15 | 3.965 | 7.419 |
| 11/9/15 | 4.026 | 7.539 |
| 11/10/15 | 4.023 | 7.622 |
| 11/11/15 | 3.98 | 7.598 |
| 11/12/15 | 4.043 | 7.738 |
| 11/13/15 | 4.012 | 7.843 |
| 11/16/15 | 3.995 | 7.878 |
| 11/17/15 | 4.004 | 7.77 |
| 11/18/15 | 4.007 | 7.96 |
| 11/19/15 | 3.976 | 7.826 |
| 11/20/15 | 3.983 | 7.817 |
| 11/23/15 | 3.992 | 7.892 |
| 11/24/15 | 3.987 | 7.94 |
| 11/25/15 | 3.985 | 7.947 |
| 11/27/15 | 3.969 | 7.941 |
| 11/30/15 | 3.988 | 7.921 |
| 12/1/15 | 3.922 | 7.843 |
| 12/2/15 | 3.941 | 7.803 |
| 12/3/15 | 4.042 | 7.88 |
| 12/4/15 | 4.027 | 7.946 |
| 12/7/15 | 4.02 | 8.079 |
| 12/8/15 | 4.022 | 8.196 |
| 12/9/15 | 4.049 | 8.261 |
| 12/10/15 | 4.07 | 8.336 |
| 12/11/15 | 4.029 | 8.573 |
| 12/14/15 | 4.113 | 8.851 |
| 12/15/15 | 4.144 | 8.708 |
| 12/16/15 | 4.149 | 8.625 |
| 12/17/15 | 4.1 | 8.603 |
| 12/18/15 | 4.089 | 8.721 |
| 12/21/15 | 4.094 | 9.233 |
| 12/22/15 | 4.106 | 9.187 |
| 12/23/15 | 4.112 | 9.11 |
| 12/24/15 | 4.101 | 9.094 |
| 12/28/15 | 4.087 | 9.127 |
| 12/29/15 | 4.12 | 9.054 |
| 12/30/15 | 4.125 | 9.036 |
| 12/31/15 | 4.104 | 9.06 |
| 1/4/16 | 4.106 | 8.484 |
| 1/5/16 | 4.12 | 8.399 |
| 1/6/16 | 4.084 | 8.412 |
| 1/7/16 | 4.09 | 8.486 |
| 1/8/16 | 4.067 | 8.446 |
| 1/11/16 | 4.093 | 8.512 |
| 1/12/16 | 4.085 | 8.549 |
| 1/13/16 | 4.082 | 8.64 |
| 1/14/16 | 4.118 | 8.769 |
| 1/15/16 | 4.122 | 8.973 |
| 1/19/16 | 4.149 | 8.988 |
| 1/20/16 | 4.186 | 9.301 |
| 1/21/16 | 4.177 | 9.211 |
| 1/22/16 | 4.196 | 8.98 |
| 1/25/16 | 4.194 | 8.955 |
| 1/26/16 | 4.187 | 8.894 |
| 1/27/16 | 4.214 | 8.863 |
| 1/28/16 | 4.196 | 8.783 |
| 1/29/16 | 4.16 | 8.725 |
| 2/1/16 | 4.182 | 8.703 |
| 2/2/16 | 4.154 | 8.78 |
| 2/3/16 | 4.156 | 8.825 |
| 2/4/16 | 4.15 | 8.793 |
| 2/5/16 | 4.151 | 8.837 |
| 2/8/16 | 4.131 | 9.058 |
| 2/9/16 | 4.149 | 9.143 |
| 2/10/16 | 4.131 | 9.094 |
| 2/11/16 | 4.116 | 9.329 |
| 2/12/16 | 4.171 | 9.21 |
| 2/16/16 | 4.192 | 9.095 |
| 2/17/16 | 4.208 | 8.915 |
| 2/18/16 | 4.15 | 8.831 |
| 2/19/16 | 4.138 | 8.84 |
| 2/22/16 | 4.13 | 8.781 |
| 2/23/16 | 4.106 | 8.783 |
| 2/24/16 | 4.09 | 8.824 |
| 2/25/16 | 4.064 | 8.702 |
| 2/26/16 | 4.072 | 8.564 |
| 2/29/16 | 4.042 | 8.449 |
| 3/1/16 | 4.025 | 8.321 |
| 3/2/16 | 4.029 | 8.227 |
| 3/3/16 | 3.997 | 8.131 |
| 3/4/16 | 4.002 | 7.988 |
| 3/7/16 | 3.992 | 7.96 |
| 3/8/16 | 3.928 | 8.028 |
| 3/9/16 | 3.943 | 8.071 |
| 3/10/16 | 3.949 | 8.015 |
| 3/11/16 | 3.918 | 7.839 |
| 3/14/16 | 3.887 | 7.796 |
| 3/15/16 | 3.911 | 7.883 |
| 3/16/16 | 3.862 | 7.924 |
| 3/17/16 | 3.796 | 7.778 |
| 3/18/16 | 3.762 | 7.673 |
| 3/21/16 | 3.765 | 7.661 |
| 3/22/16 | 3.763 | 7.696 |
| 3/23/16 | 3.743 | 7.751 |
| 3/24/16 | 3.75 | 7.891 |
| 3/28/16 | 3.751 | 7.945 |
| 3/29/16 | 3.724 | 7.962 |
| 3/30/16 | 3.707 | 7.915 |
| 3/31/16 | 3.668 | 7.857 |
| 4/1/16 | 3.64 | 7.924 |
| 4/4/16 | 3.626 | 7.932 |
| 4/5/16 | 3.6 | 8.003 |
| 4/6/16 | 3.616 | 7.948 |
| 4/7/16 | 3.587 | 7.964 |
| 4/8/16 | 3.623 | 7.931 |
| 4/11/16 | 3.629 | 7.898 |
| 4/12/16 | 3.648 | 7.816 |
| 4/13/16 | 3.636 | 7.75 |
| 4/14/16 | 3.636 | 7.578 |
| 4/15/16 | 3.596 | 7.599 |
| 4/18/16 | 3.611 | 7.627 |
| 4/19/16 | 3.584 | 7.493 |
| 4/20/16 | 3.577 | 7.413 |
| 4/21/16 | 3.601 | 7.525 |
| 4/22/16 | 3.602 | 7.509 |
| 4/25/16 | 3.608 | 7.592 |
| 4/26/16 | 3.633 | 7.556 |
| 4/27/16 | 3.611 | 7.481 |
| 4/28/16 | 3.58 | 7.395 |
| 4/29/16 | 3.567 | 7.393 |
| 5/2/16 | 3.567 | 7.211 |
| 5/3/16 | 3.545 | 7.322 |
| 5/4/16 | 3.56 | 7.364 |
| 5/5/16 | 3.542 | 7.403 |
| 5/6/16 | 3.562 | 7.461 |
| 5/9/16 | 3.568 | 7.485 |
| 5/10/16 | 3.562 | 7.463 |
| 5/11/16 | 3.554 | 7.385 |
| 5/12/16 | 3.575 | 7.4 |
| 5/13/16 | 3.564 | 7.402 |
| 5/16/16 | 3.583 | 7.399 |
| 5/17/16 | 3.587 | 7.35 |
| 5/18/16 | 3.653 | 7.369 |
| 5/19/16 | 3.683 | 7.483 |
| 5/20/16 | 3.682 | 7.418 |
| 5/23/16 | 3.68 | 7.433 |
| 5/24/16 | 3.695 | 7.39 |
| 5/25/16 | 3.68 | 7.313 |
| 5/26/16 | 3.641 | 7.301 |
| 5/27/16 | 3.632 | 7.293 |
| 5/31/16 | 3.649 | 7.308 |
| 6/1/16 | 3.638 | 7.247 |
| 6/2/16 | 3.613 | 7.269 |
| 6/3/16 | 3.549 | 7.242 |
| 6/6/16 | 3.55 | 7.2 |
| 6/7/16 | 3.53 | 7.058 |
| 6/8/16 | 3.512 | 6.957 |
| 6/9/16 | 3.494 | 7.046 |
| 6/10/16 | 3.491 | 7.112 |
| 6/13/16 | 3.493 | 7.16 |
| 6/14/16 | 3.513 | 7.288 |
| 6/15/16 | 3.501 | 7.256 |
| 6/16/16 | 3.489 | 7.342 |
| 6/17/16 | 3.503 | 7.262 |
| 6/20/16 | 3.518 | 7.114 |
| 6/21/16 | 3.523 | 7.133 |
| 6/22/16 | 3.512 | 7.061 |
| 6/23/16 | 3.517 | 7 |
| 6/24/16 | 3.486 | 7.176 |
| 6/27/16 | 3.438 | 7.337 |
| 6/28/16 | 3.412 | 7.263 |
| 6/29/16 | 3.384 | 7.135 |
| 6/30/16 | 3.381 | 7.047 |
| 7/1/16 | 3.331 | 6.811 |
| 7/5/16 | 3.272 | 6.808 |
| 7/6/16 | 3.262 | 6.83 |
| 7/7/16 | 3.248 | 6.752 |
| 7/8/16 | 3.215 | 6.66 |
| 7/11/16 | 3.215 | 6.521 |
| 7/12/16 | 3.256 | 6.4 |
| 7/13/16 | 3.231 | 6.458 |
| 7/14/16 | 3.264 | 6.364 |
| 7/15/16 | 3.299 | 6.415 |
| 7/18/16 | 3.303 | 6.424 |
| 7/19/16 | 3.289 | 6.431 |
| 7/20/16 | 3.3 | 6.411 |
| 7/21/16 | 3.295 | 6.394 |
| 7/22/16 | 3.282 | 6.4 |
| 7/25/16 | 3.297 | 6.401 |
| 7/26/16 | 3.318 | 6.458 |
| 7/27/16 | 3.3 | 6.461 |
| 7/28/16 | 3.296 | 6.496 |
| 7/29/16 | 3.266 | 6.535 |
| 8/1/16 | 3.285 | 6.628 |
| 8/2/16 | 3.334 | 6.681 |
| 8/3/16 | 3.338 | 6.65 |
| 8/4/16 | 3.284 | 6.56 |
| 8/5/16 | 3.315 | 6.486 |
| 8/8/16 | 3.313 | 6.441 |
| 8/9/16 | 3.287 | 6.367 |
| 8/10/16 | 3.248 | 6.354 |
| 8/11/16 | 3.271 | 6.362 |
| 8/12/16 | 3.24 | 6.326 |
| 8/15/16 | 3.263 | 6.288 |
| 8/16/16 | 3.259 | 6.267 |
| 8/17/16 | 3.26 | 6.296 |
| 8/18/16 | 3.236 | 6.28 |
| 8/19/16 | 3.255 | 6.268 |
| 8/22/16 | 3.229 | 6.276 |
| 8/23/16 | 3.212 | 6.264 |
| 8/24/16 | 3.224 | 6.263 |
| 8/25/16 | 3.242 | 6.293 |
| 8/26/16 | 3.249 | 6.278 |
| 8/29/16 | 3.246 | 6.274 |
| 8/30/16 | 3.239 | 6.262 |
| 8/31/16 | 3.244 | 6.278 |
| 9/1/16 | 3.252 | 6.279 |
| 9/2/16 | 3.266 | 6.241 |
| 9/6/16 | 3.246 | 6.22 |
| 9/7/16 | 3.238 | 6.185 |
| 9/8/16 | 3.291 | 6.196 |
| 9/9/16 | 3.365 | 6.294 |
| 9/12/16 | 3.388 | 6.355 |
| 9/13/16 | 3.427 | 6.416 |
| 9/14/16 | 3.414 | 6.429 |
| 9/15/16 | 3.422 | 6.44 |
| 9/16/16 | 3.409 | 6.426 |
| 9/19/16 | 3.417 | 6.426 |
| 9/20/16 | 3.383 | 6.298 |
| 9/21/16 | 3.405 | 6.361 |
| 9/22/16 | 3.327 | 6.222 |
| 9/23/16 | 3.316 | 6.23 |
| 9/26/16 | 3.309 | 6.256 |
| 9/27/16 | 3.3 | 6.274 |
| 9/28/16 | 3.291 | 6.349 |
| 9/29/16 | 3.297 | 6.344 |
| 9/30/16 | 3.47 | 6.314 |
| 10/3/16 | 3.307 | 6.186 |
| 10/4/16 | 3.338 | 6.172 |
| 10/5/16 | 3.37 | 6.154 |
| 10/6/16 | 3.371 | 6.309 |
| 10/7/16 | 3.368 | 6.399 |
| 10/10/16 | 3.369 | 6.385 |
| 10/11/16 | 3.391 | 6.401 |
| 10/12/16 | 3.397 | 6.403 |
| 10/13/16 | 3.364 | 6.426 |
| 10/14/16 | 3.382 | 6.386 |
| 10/17/16 | 3.371 | 6.38 |
| 10/18/16 | 3.352 | 6.345 |
| 10/19/16 | 3.339 | 6.292 |
| 10/20/16 | 3.341 | 6.274 |
| 10/21/16 | 3.351 | 6.273 |
| 10/24/16 | 3.368 | 6.263 |
| 10/25/16 | 3.382 | 6.272 |
| 10/26/16 | 3.418 | 6.329 |
| 10/27/16 | 3.463 | 6.38 |
| 10/28/16 | 3.499 | 6.43 |
| 10/31/16 | 3.471 | 6.493 |
| 11/1/16 | 3.478 | 6.347 |
| 11/2/16 | 3.466 | 6.45 |
| 11/3/16 | 3.506 | 6.448 |
| 11/4/16 | 3.483 | 6.46 |
| 11/7/16 | 3.491 | 6.343 |
| 11/8/16 | 3.509 | 6.318 |
| 11/9/16 | 3.612 | 6.416 |
| 11/10/16 | 3.655 | 6.507 |
| 11/11/16 | 3.654 | 6.513 |
| 11/14/16 | 3.782 | 6.752 |
| 11/15/16 | 3.776 | 6.634 |
| 11/16/16 | 3.783 | 6.612 |
| 11/17/16 | 3.813 | 6.576 |
| 11/18/16 | 3.876 | 6.604 |
| 11/21/16 | 3.878 | 6.584 |
| 11/22/16 | 3.88 | 6.572 |
| 11/23/16 | 3.921 | 6.634 |
| 11/25/16 | 3.93 | 6.532 |
| 11/28/16 | 3.88 | 6.731 |
| 11/29/16 | 3.905 | 6.701 |
| 11/30/16 | 3.894 | 6.726 |
| 12/1/16 | 3.919 | 6.619 |
| 12/2/16 | 3.86 | 6.72 |
| 12/5/16 | 3.88 | 6.678 |
| 12/6/16 | 3.867 | 6.622 |
| 12/7/16 | 3.826 | 6.51 |
| 12/8/16 | 3.847 | 6.491 |
| 12/9/16 | 3.998 | 6.465 |
| 12/12/16 | 4.011 | 6.445 |
| 12/13/16 | 3.917 | 6.427 |
| 12/14/16 | 3.889 | 6.421 |
| 12/15/16 | 3.963 | 6.527 |
| 12/16/16 | 3.961 | 6.529 |
| 12/19/16 | 3.951 | 6.524 |
| 12/20/16 | 3.96 | 6.515 |
| 12/21/16 | 3.93 | 6.498 |
| 12/22/16 | 3.93 | 6.47 |
| 12/23/16 | 3.91 | 6.451 |
| 12/27/16 | 3.932 | 6.475 |
| 12/28/16 | 3.906 | 6.417 |
| 12/29/16 | 3.861 | 6.401 |
| 12/30/16 | 3.844 | 6.409 |